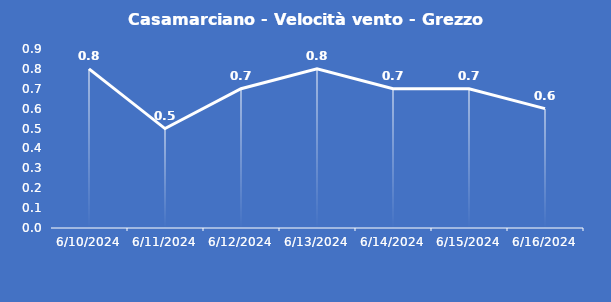
| Category | Casamarciano - Velocità vento - Grezzo (m/s) |
|---|---|
| 6/10/24 | 0.8 |
| 6/11/24 | 0.5 |
| 6/12/24 | 0.7 |
| 6/13/24 | 0.8 |
| 6/14/24 | 0.7 |
| 6/15/24 | 0.7 |
| 6/16/24 | 0.6 |